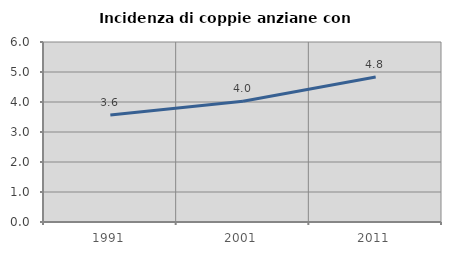
| Category | Incidenza di coppie anziane con figli |
|---|---|
| 1991.0 | 3.567 |
| 2001.0 | 4.025 |
| 2011.0 | 4.832 |